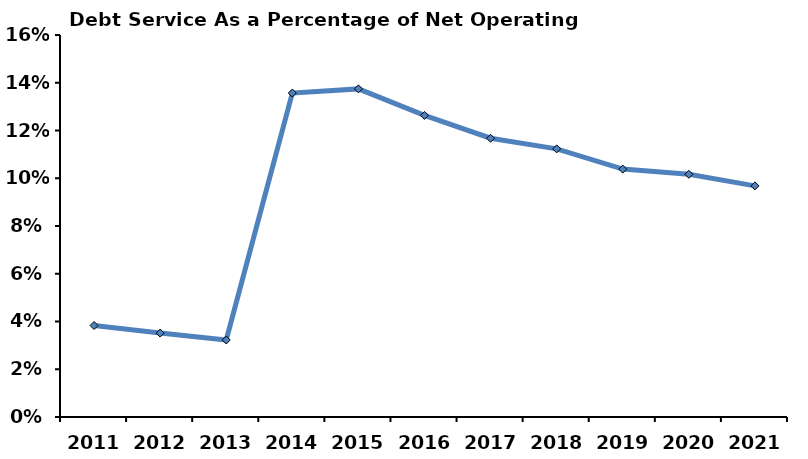
| Category | Total |
|---|---|
| 2011.0 | 0.038 |
| 2012.0 | 0.035 |
| 2013.0 | 0.032 |
| 2014.0 | 0.136 |
| 2015.0 | 0.137 |
| 2016.0 | 0.126 |
| 2017.0 | 0.117 |
| 2018.0 | 0.112 |
| 2019.0 | 0.104 |
| 2020.0 | 0.102 |
| 2021.0 | 0.097 |